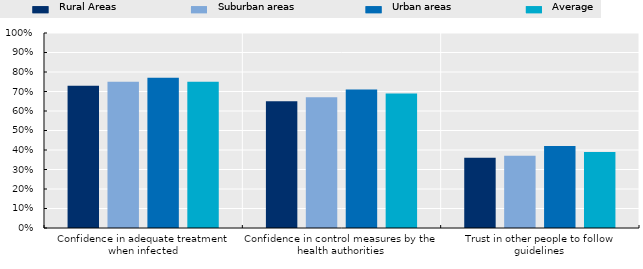
| Category | Rural Areas | Suburban areas | Urban areas | Average |
|---|---|---|---|---|
| Confidence in adequate treatment when infected | 0.73 | 0.75 | 0.77 | 0.75 |
| Confidence in control measures by the health authorities | 0.65 | 0.67 | 0.71 | 0.69 |
| Trust in other people to follow guidelines | 0.36 | 0.37 | 0.42 | 0.39 |